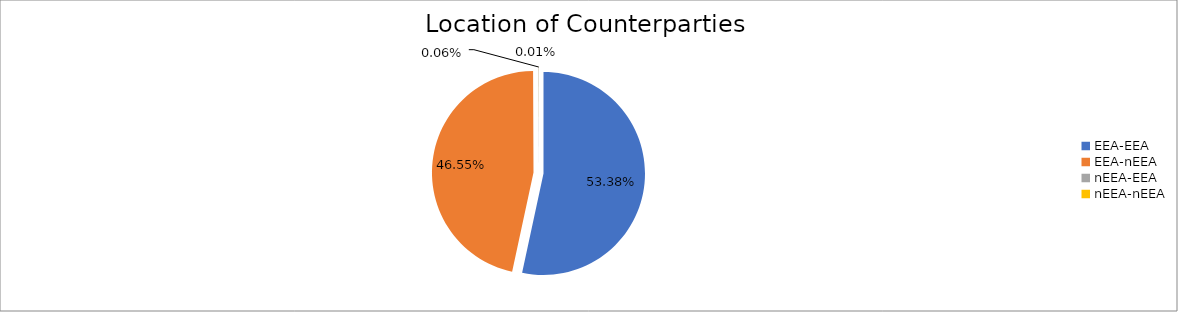
| Category | Series 0 |
|---|---|
| EEA-EEA | 6598550.96 |
| EEA-nEEA | 5754815.733 |
| nEEA-EEA | 7034.017 |
| nEEA-nEEA | 1209.424 |